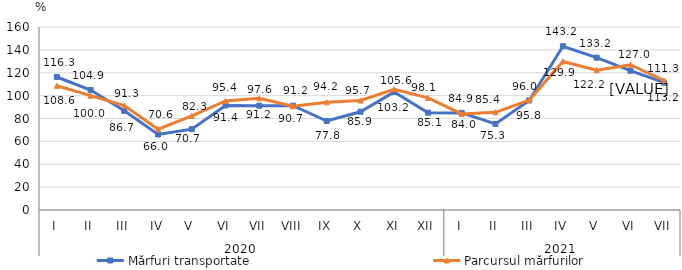
| Category | Mărfuri transportate | Parcursul mărfurilor |
|---|---|---|
| 0 | 116.3 | 108.6 |
| 1 | 104.9 | 100 |
| 2 | 86.7 | 91.3 |
| 3 | 66 | 70.6 |
| 4 | 70.7 | 82.3 |
| 5 | 91.4 | 95.4 |
| 6 | 91.2 | 97.6 |
| 7 | 91.2 | 90.7 |
| 8 | 77.8 | 94.2 |
| 9 | 85.9 | 95.7 |
| 10 | 103.2 | 105.6 |
| 11 | 85.1 | 98.1 |
| 12 | 84.9 | 84 |
| 13 | 75.3 | 85.4 |
| 14 | 95.8 | 96 |
| 15 | 143.2 | 129.9 |
| 16 | 133.2 | 122.2 |
| 17 | 121.8 | 127 |
| 18 | 111.3 | 113.2 |